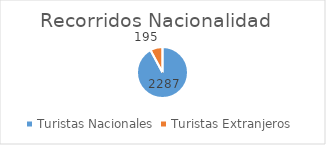
| Category | Series 0 |
|---|---|
| Turistas Nacionales  | 2287 |
| Turistas Extranjeros  | 195 |